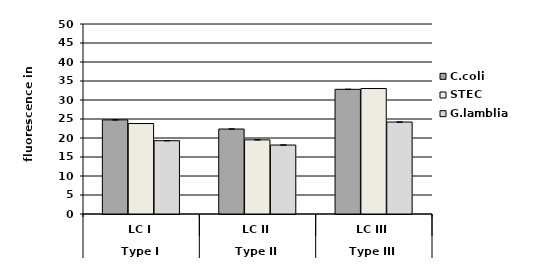
| Category | C.coli | STEC | G.lamblia |
|---|---|---|---|
| 0 | 24.77 | 23.81 | 19.29 |
| 1 | 22.361 | 19.515 | 18.147 |
| 2 | 32.809 | 33.02 | 24.2 |